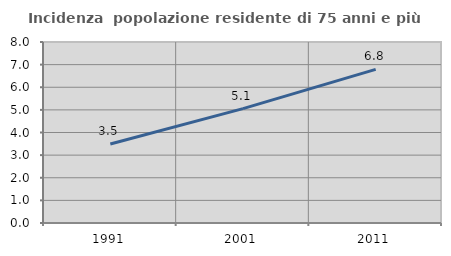
| Category | Incidenza  popolazione residente di 75 anni e più |
|---|---|
| 1991.0 | 3.494 |
| 2001.0 | 5.057 |
| 2011.0 | 6.791 |